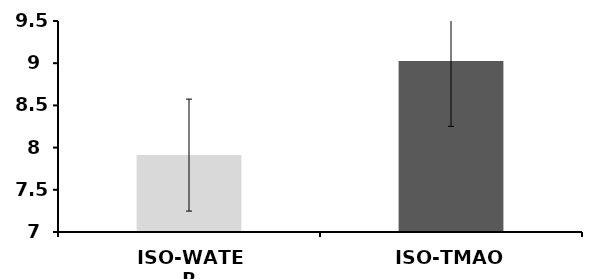
| Category | Series 0 |
|---|---|
| ISO-WATER | 7.911 |
| ISO-TMAO | 9.026 |